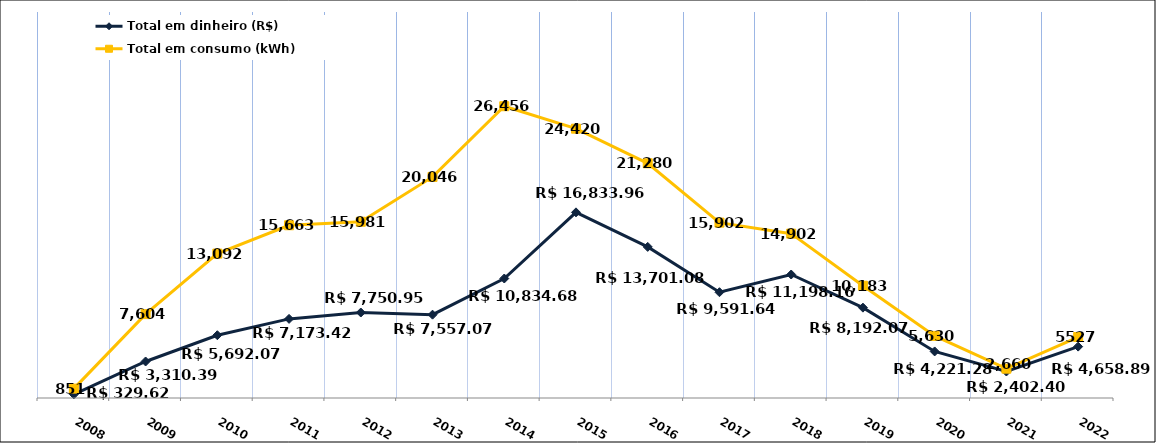
| Category | Total em dinheiro (R$) |
|---|---|
| 2008.0 | 329.62 |
| 2009.0 | 3310.39 |
| 2010.0 | 5692.07 |
| 2011.0 | 7173.42 |
| 2012.0 | 7750.95 |
| 2013.0 | 7557.07 |
| 2014.0 | 10834.68 |
| 2015.0 | 16833.96 |
| 2016.0 | 13701.08 |
| 2017.0 | 9591.64 |
| 2018.0 | 11198.16 |
| 2019.0 | 8192.07 |
| 2020.0 | 4221.28 |
| 2021.0 | 2402.4 |
| 2022.0 | 4658.89 |